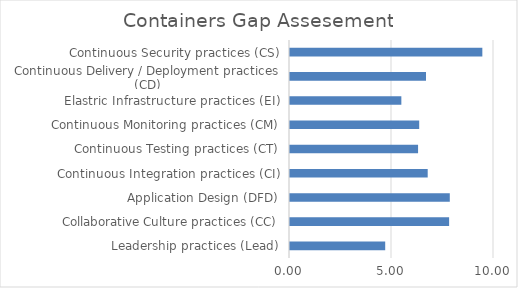
| Category | Series 0 |
|---|---|
| Leadership practices (Lead) | 4.667 |
| Collaborative Culture practices (CC) | 7.8 |
| Application Design (DFD) | 7.833 |
| Continuous Integration practices (CI) | 6.75 |
| Continuous Testing practices (CT) | 6.278 |
| Continuous Monitoring practices (CM) | 6.333 |
| Elastric Infrastructure practices (EI) | 5.458 |
| Continuous Delivery / Deployment practices (CD) | 6.667 |
| Continuous Security practices (CS) | 9.429 |